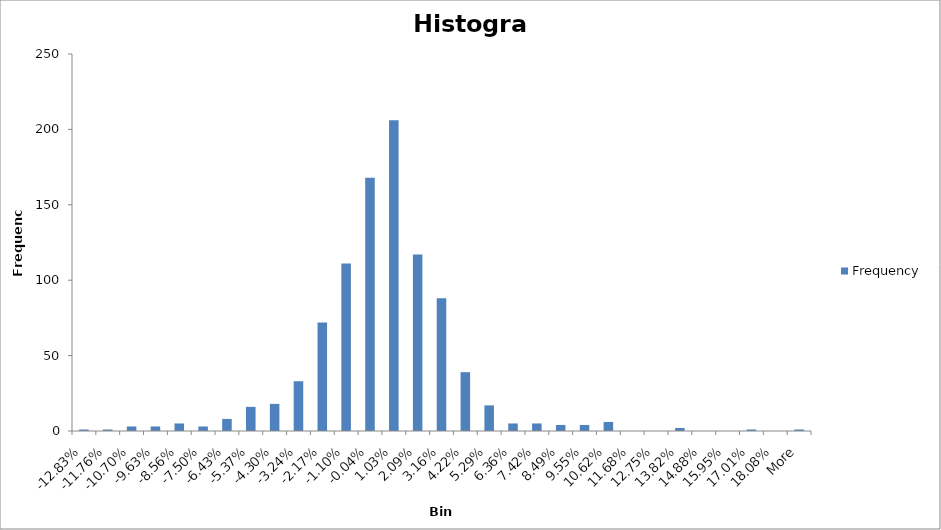
| Category | Frequency |
|---|---|
| -12.83% | 1 |
| -11.76% | 1 |
| -10.70% | 3 |
| -9.63% | 3 |
| -8.56% | 5 |
| -7.50% | 3 |
| -6.43% | 8 |
| -5.37% | 16 |
| -4.30% | 18 |
| -3.24% | 33 |
| -2.17% | 72 |
| -1.10% | 111 |
| -0.04% | 168 |
| 1.03% | 206 |
| 2.09% | 117 |
| 3.16% | 88 |
| 4.22% | 39 |
| 5.29% | 17 |
| 6.36% | 5 |
| 7.42% | 5 |
| 8.49% | 4 |
| 9.55% | 4 |
| 10.62% | 6 |
| 11.68% | 0 |
| 12.75% | 0 |
| 13.82% | 2 |
| 14.88% | 0 |
| 15.95% | 0 |
| 17.01% | 1 |
| 18.08% | 0 |
| More | 1 |